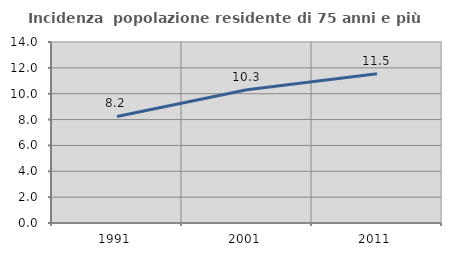
| Category | Incidenza  popolazione residente di 75 anni e più |
|---|---|
| 1991.0 | 8.243 |
| 2001.0 | 10.306 |
| 2011.0 | 11.538 |